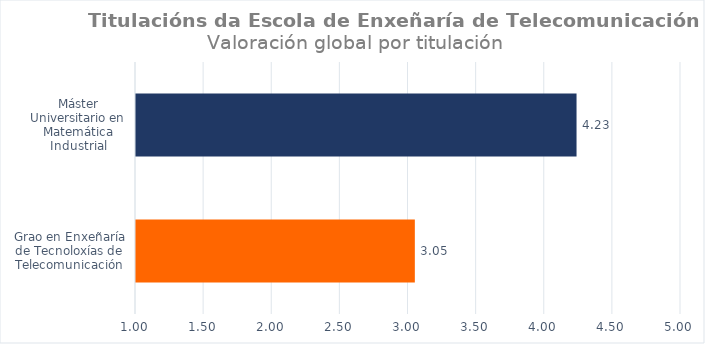
| Category | Series 0 |
|---|---|
| Grao en Enxeñaría de Tecnoloxías de Telecomunicación | 3.047 |
| Máster Universitario en Matemática Industrial | 4.233 |